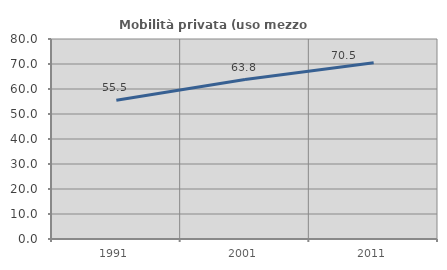
| Category | Mobilità privata (uso mezzo privato) |
|---|---|
| 1991.0 | 55.493 |
| 2001.0 | 63.797 |
| 2011.0 | 70.486 |